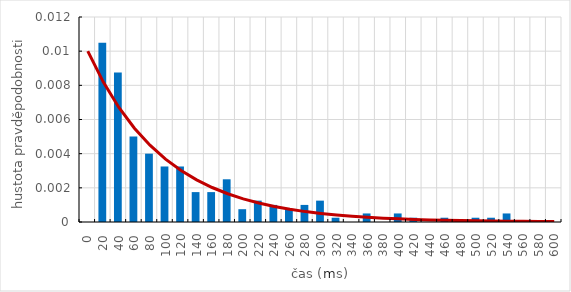
| Category | Series 0 |
|---|---|
| 0.0 | 0 |
| 20.0 | 0.01 |
| 40.0 | 0.009 |
| 60.0 | 0.005 |
| 80.0 | 0.004 |
| 100.0 | 0.003 |
| 120.0 | 0.003 |
| 140.0 | 0.002 |
| 160.0 | 0.002 |
| 180.0 | 0.002 |
| 200.0 | 0.001 |
| 220.0 | 0.001 |
| 240.0 | 0.001 |
| 260.0 | 0.001 |
| 280.0 | 0.001 |
| 300.0 | 0.001 |
| 320.0 | 0 |
| 340.0 | 0 |
| 360.0 | 0 |
| 380.0 | 0 |
| 400.0 | 0 |
| 420.0 | 0 |
| 440.0 | 0 |
| 460.0 | 0 |
| 480.0 | 0 |
| 500.0 | 0 |
| 520.0 | 0 |
| 540.0 | 0 |
| 560.0 | 0 |
| 580.0 | 0 |
| 600.0 | 0 |